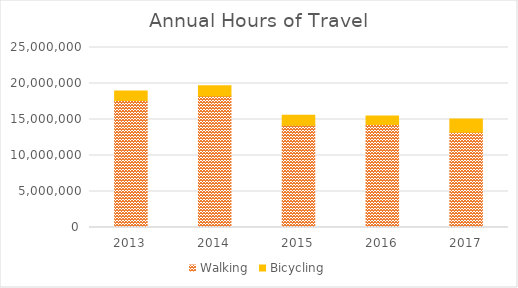
| Category | Walking | Bicycling |
|---|---|---|
| 2013 | 17638101.124 | 1335341.043 |
| 2014 | 18263687.095 | 1435030.047 |
| 2015 | 14198563.522 | 1377557.755 |
| 2016 | 14313148.523 | 1185292.601 |
| 2017 | 13224900.462 | 1830051.78 |